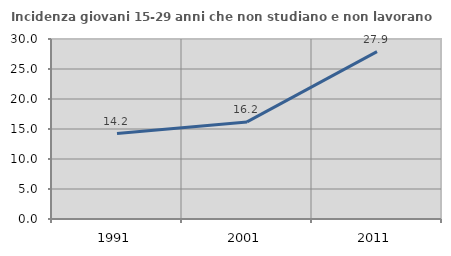
| Category | Incidenza giovani 15-29 anni che non studiano e non lavorano  |
|---|---|
| 1991.0 | 14.244 |
| 2001.0 | 16.185 |
| 2011.0 | 27.891 |